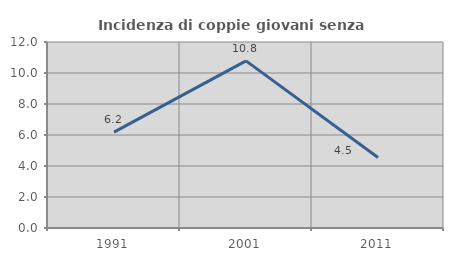
| Category | Incidenza di coppie giovani senza figli |
|---|---|
| 1991.0 | 6.186 |
| 2001.0 | 10.784 |
| 2011.0 | 4.545 |